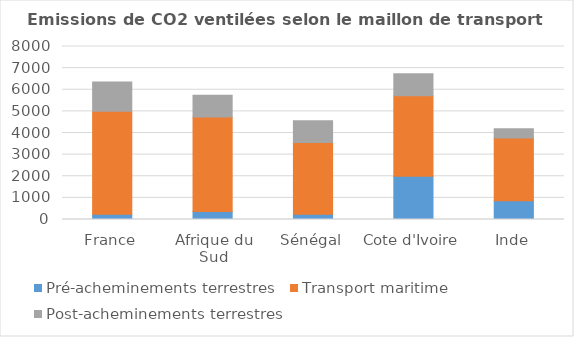
| Category | Pré-acheminements terrestres | Transport maritime | Post-acheminements terrestres |
|---|---|---|---|
| France | 242.692 | 4758.448 | 1362.077 |
| Afrique du Sud | 368.17 | 4371.85 | 1006.8 |
| Sénégal | 237.082 | 3321.221 | 1006.8 |
| Cote d'Ivoire | 1997.212 | 3724.043 | 1019.475 |
| Inde | 864.382 | 2899.8 | 427.675 |